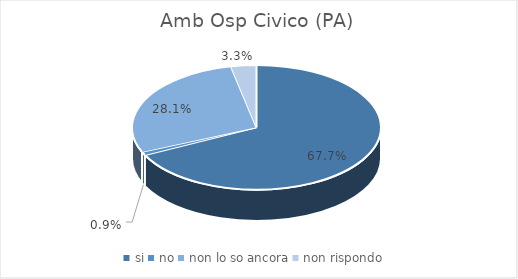
| Category | Amb Osp Civico (PA) |
|---|---|
| si | 0.677 |
| no | 0.009 |
| non lo so ancora | 0.281 |
| non rispondo | 0.033 |